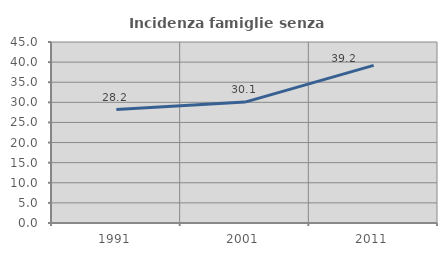
| Category | Incidenza famiglie senza nuclei |
|---|---|
| 1991.0 | 28.202 |
| 2001.0 | 30.065 |
| 2011.0 | 39.179 |